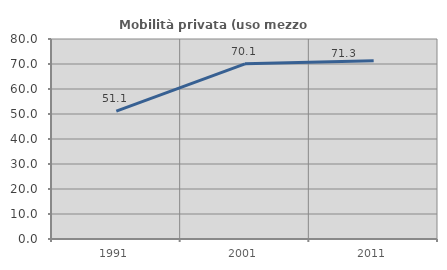
| Category | Mobilità privata (uso mezzo privato) |
|---|---|
| 1991.0 | 51.148 |
| 2001.0 | 70.074 |
| 2011.0 | 71.289 |